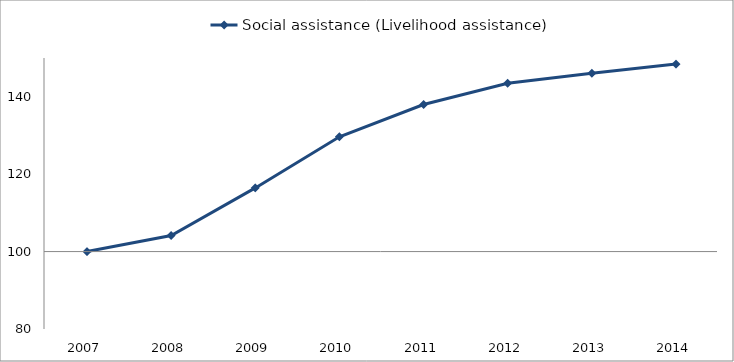
| Category | Social assistance (Livelihood assistance) |
|---|---|
| 2007.0 | 100 |
| 2008.0 | 104.139 |
| 2009.0 | 116.442 |
| 2010.0 | 129.646 |
| 2011.0 | 137.995 |
| 2012.0 | 143.488 |
| 2013.0 | 146.061 |
| 2014.0 | 148.425 |